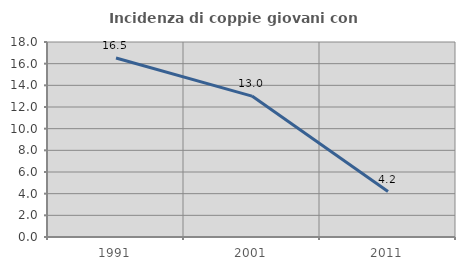
| Category | Incidenza di coppie giovani con figli |
|---|---|
| 1991.0 | 16.522 |
| 2001.0 | 13.008 |
| 2011.0 | 4.196 |